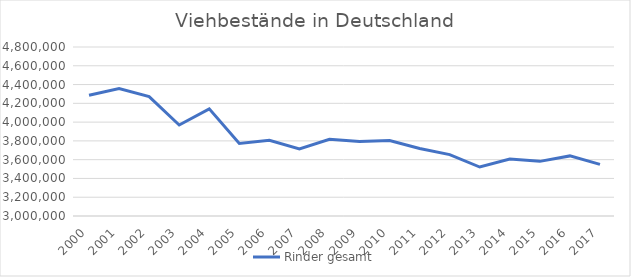
| Category | Rinder gesamt |
|---|---|
| 2000.0 | 4285724 |
| 2001.0 | 4356958 |
| 2002.0 | 4272078 |
| 2003.0 | 3969135 |
| 2004.0 | 4141144 |
| 2005.0 | 3772807 |
| 2006.0 | 3806192 |
| 2007.0 | 3715064 |
| 2008.0 | 3817624 |
| 2009.0 | 3794128 |
| 2010.0 | 3803813 |
| 2011.0 | 3719013 |
| 2012.0 | 3653786 |
| 2013.0 | 3521572 |
| 2014.0 | 3606443 |
| 2015.0 | 3581953 |
| 2016.0 | 3640070 |
| 2017.0 | 3549432 |